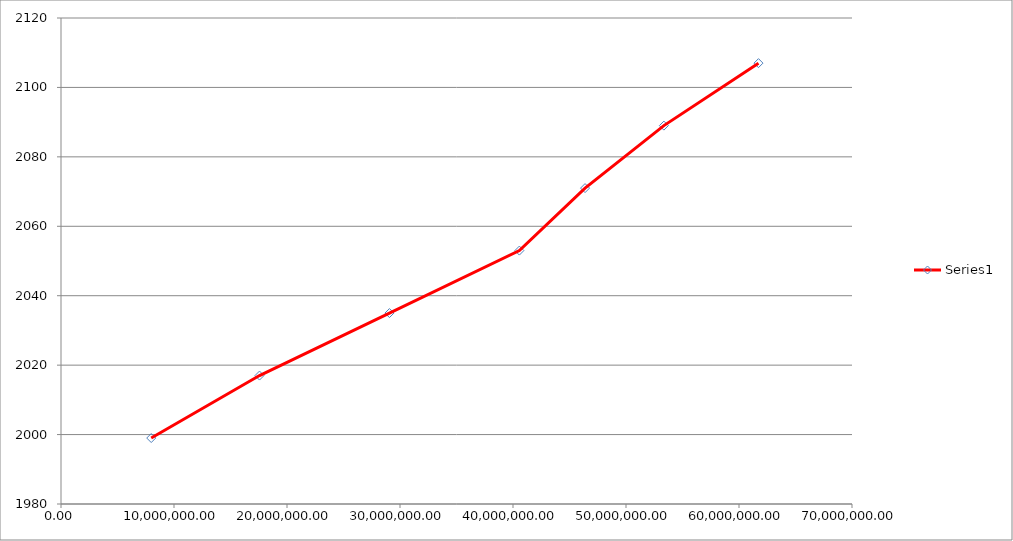
| Category | Series 0 |
|---|---|
| 7985000.0 | 1999 |
| 17567000.0 | 2017 |
| 29065400.0 | 2035 |
| 40563800.0 | 2053 |
| 46376880.0 | 2071 |
| 53352576.0 | 2089 |
| 61723411.2 | 2107 |